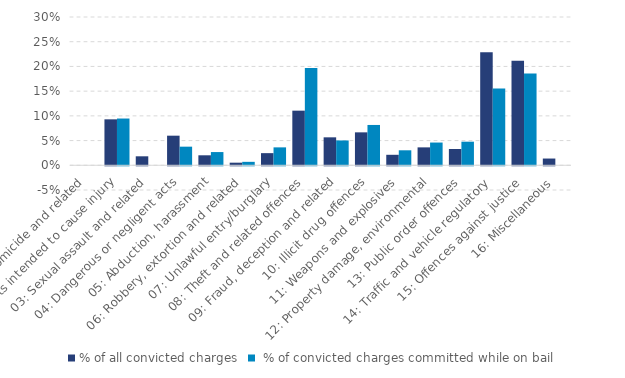
| Category | % of all convicted charges |  % of convicted charges committed while on bail |
|---|---|---|
| 01: Homicide and related | 0 | 0 |
| 02: Acts intended to cause injury | 0.093 | 0.095 |
| 03: Sexual assault and related | 0.018 | 0 |
| 04: Dangerous or negligent acts | 0.06 | 0.038 |
| 05: Abduction, harassment | 0.02 | 0.027 |
| 06: Robbery, extortion and related | 0.005 | 0.007 |
| 07: Unlawful entry/burglary | 0.025 | 0.036 |
| 08: Theft and related offences | 0.111 | 0.197 |
| 09: Fraud, deception and related | 0.057 | 0.05 |
| 10: Illicit drug offences | 0.067 | 0.082 |
| 11: Weapons and explosives | 0.021 | 0.03 |
| 12: Property damage, environmental | 0.036 | 0.046 |
| 13: Public order offences | 0.033 | 0.048 |
| 14: Traffic and vehicle regulatory | 0.229 | 0.155 |
| 15: Offences against justice | 0.211 | 0.186 |
| 16: Miscellaneous | 0.014 | 0 |